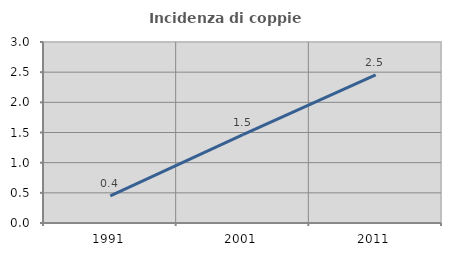
| Category | Incidenza di coppie miste |
|---|---|
| 1991.0 | 0.45 |
| 2001.0 | 1.467 |
| 2011.0 | 2.455 |